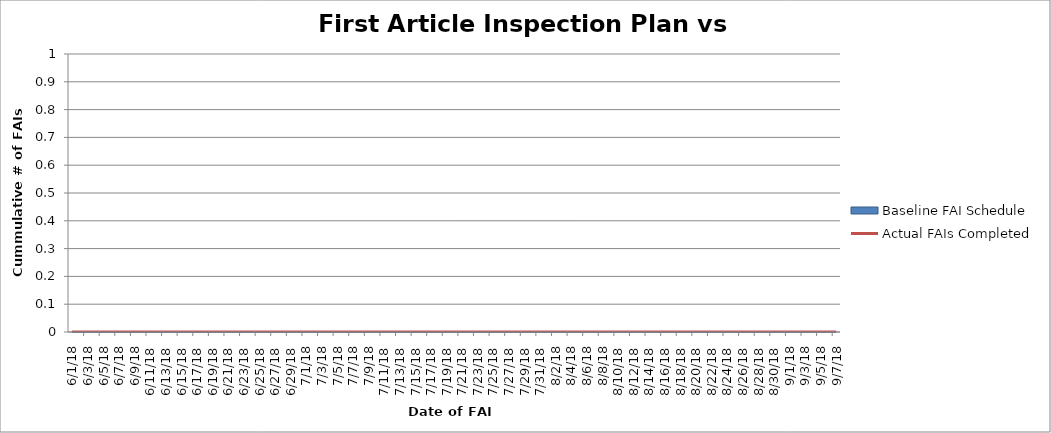
| Category | Actual FAIs Completed |
|---|---|
| 6/1/18 | 0 |
| 6/8/18 | 0 |
| 6/15/18 | 0 |
| 6/22/18 | 0 |
| 6/29/18 | 0 |
| 7/6/18 | 0 |
| 7/13/18 | 0 |
| 7/20/18 | 0 |
| 7/27/18 | 0 |
| 8/3/18 | 0 |
| 8/10/18 | 0 |
| 8/17/18 | 0 |
| 8/24/18 | 0 |
| 8/31/18 | 0 |
| 9/7/18 | 0 |